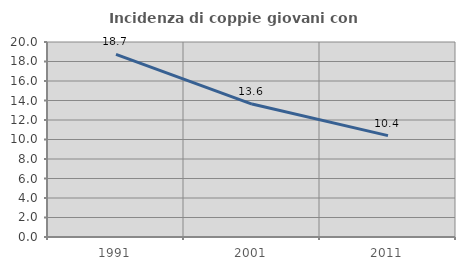
| Category | Incidenza di coppie giovani con figli |
|---|---|
| 1991.0 | 18.739 |
| 2001.0 | 13.636 |
| 2011.0 | 10.399 |